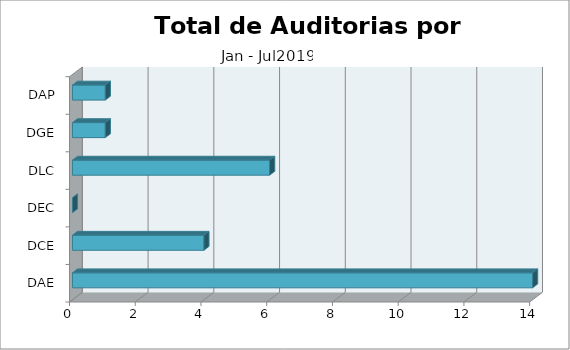
| Category | TOTAL |
|---|---|
| DAE | 14 |
| DCE | 4 |
| DEC | 0 |
| DLC | 6 |
| DGE | 1 |
| DAP | 1 |